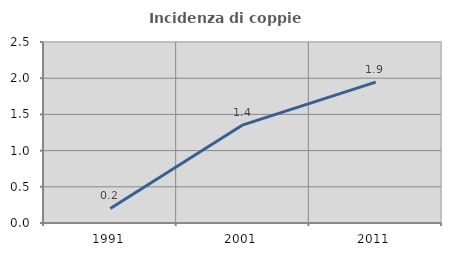
| Category | Incidenza di coppie miste |
|---|---|
| 1991.0 | 0.201 |
| 2001.0 | 1.356 |
| 2011.0 | 1.945 |